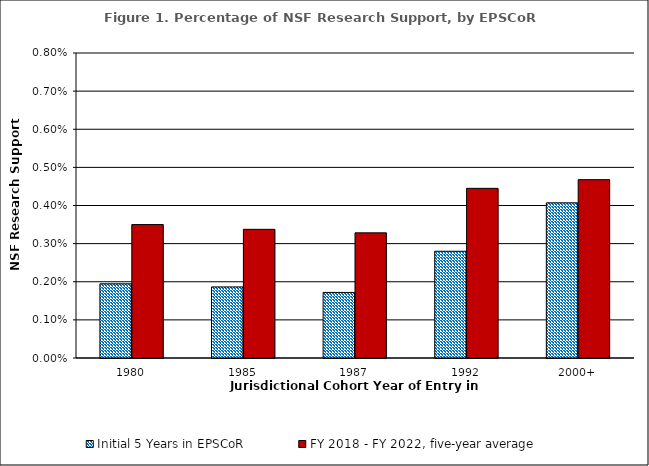
| Category | Initial 5 Years in EPSCoR | FY 2018 - FY 2022, five-year average |
|---|---|---|
| 1980 | 0.002 | 0.003 |
| 1985 | 0.002 | 0.003 |
| 1987 | 0.002 | 0.003 |
| 1992 | 0.003 | 0.004 |
| 2000+ | 0.004 | 0.005 |